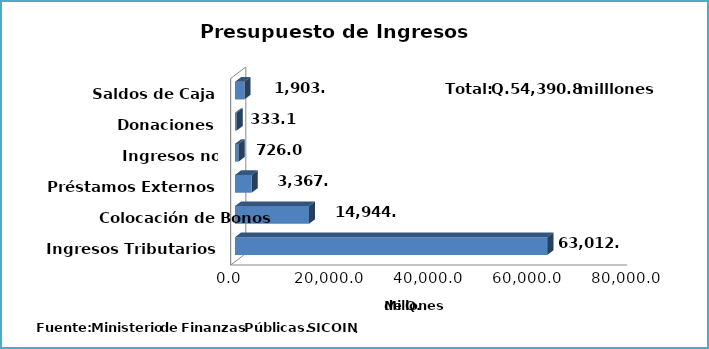
| Category | Series 0 |
|---|---|
| Ingresos Tributarios | 63012.4 |
| Colocación de Bonos | 14944.3 |
| Préstamos Externos | 3367.6 |
| Ingresos no Tributarios | 726 |
| Donaciones | 333.1 |
| Saldos de Caja | 1903.4 |